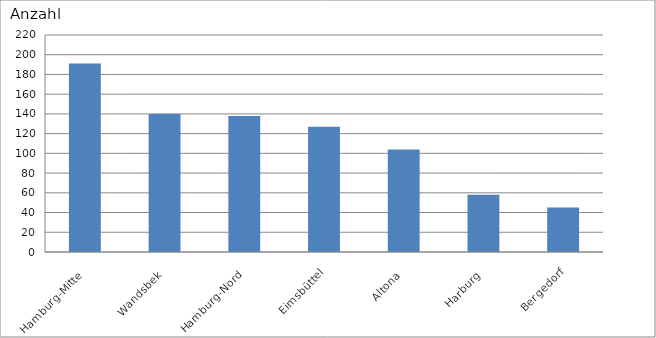
| Category | Hamburg-Mitte |
|---|---|
| Hamburg-Mitte | 191 |
| Wandsbek | 140 |
| Hamburg-Nord | 138 |
| Eimsbüttel | 127 |
| Altona | 104 |
| Harburg | 58 |
| Bergedorf | 45 |